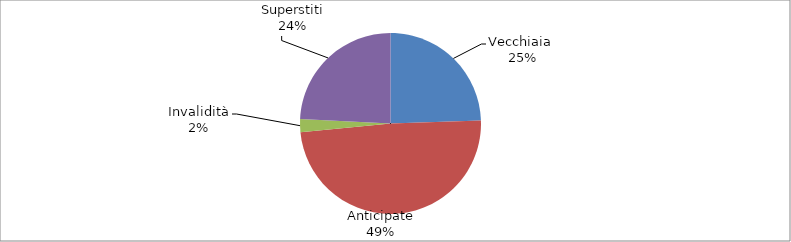
| Category | Series 0 |
|---|---|
| Vecchiaia  | 22561 |
| Anticipate | 45166 |
| Invalidità | 2142 |
| Superstiti | 22333 |